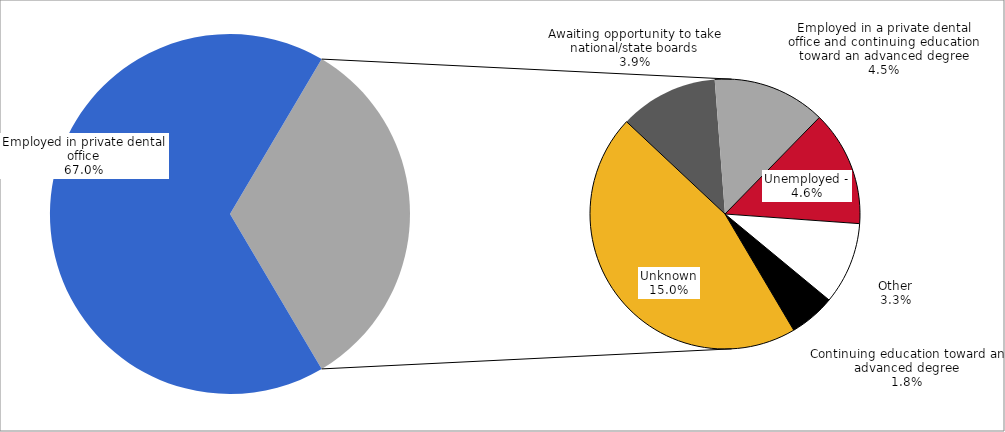
| Category | Series 0 |
|---|---|
| Employed in private dental office | 0.67 |
| Unknown | 0.15 |
| Awaiting opportunity to take national/state boards | 0.039 |
| Employed in a private dental office and continuing education toward an advanced degree | 0.045 |
| Unemployed - | 0.046 |
| Other | 0.033 |
| Continuing education toward an advanced degree | 0.018 |